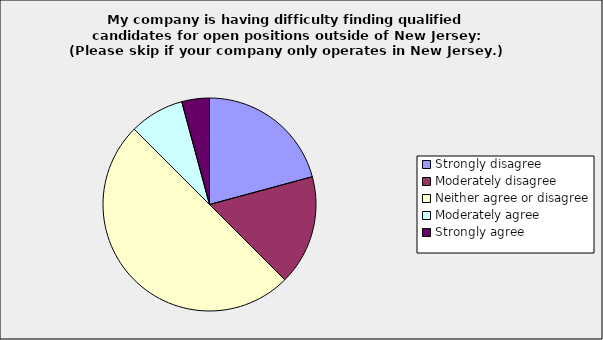
| Category | Series 0 |
|---|---|
| Strongly disagree | 0.208 |
| Moderately disagree | 0.167 |
| Neither agree or disagree | 0.5 |
| Moderately agree | 0.083 |
| Strongly agree | 0.042 |